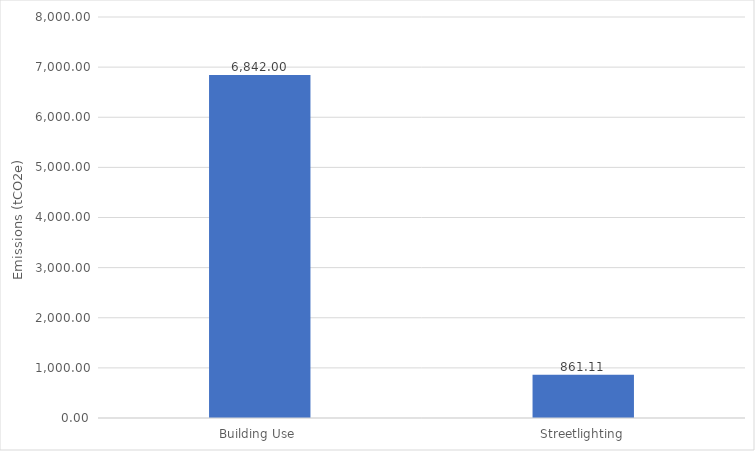
| Category | Emissions
(tCO2e) |
|---|---|
| Building Use  | 6841.999 |
| Streetlighting | 861.114 |